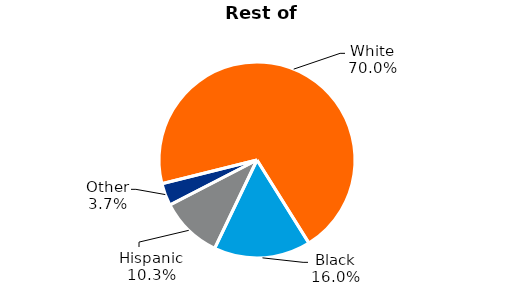
| Category | Rest of State |
|---|---|
| White | 70 |
| Black | 16 |
| Hispanic | 10.3 |
| Other | 3.7 |